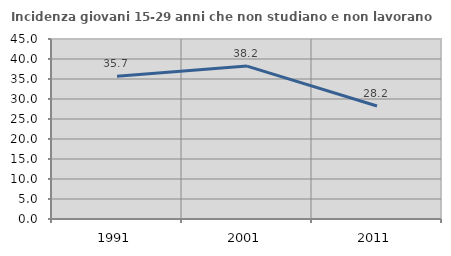
| Category | Incidenza giovani 15-29 anni che non studiano e non lavorano  |
|---|---|
| 1991.0 | 35.714 |
| 2001.0 | 38.221 |
| 2011.0 | 28.248 |